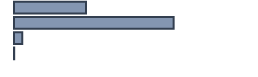
| Category | Percentatge |
|---|---|
| 0 | 30 |
| 1 | 66.515 |
| 2 | 3.409 |
| 3 | 0.076 |